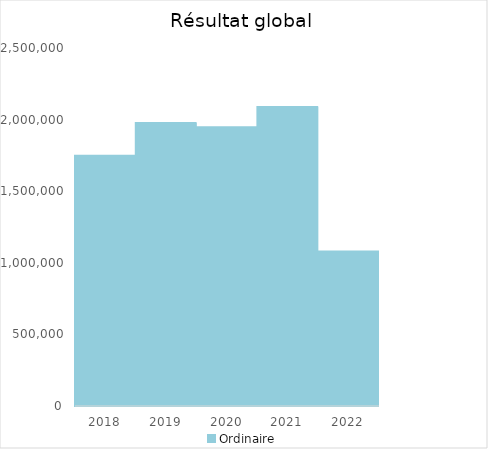
| Category |   | Ordinaire |    |
|---|---|---|---|
| 2018.0 |  | 1746834.75 |  |
| 2019.0 |  | 1976019.36 |  |
| 2020.0 |  | 1945848.12 |  |
| 2021.0 |  | 2087335.4 |  |
| 2022.0 |  | 1079121.83 |  |